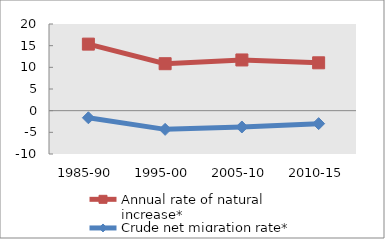
| Category | Annual rate of natural increase* | Crude net migration rate* |
|---|---|---|
| 1985-90 | 15.357 | -1.641 |
| 1995-00 | 10.836 | -4.314 |
| 2005-10 | 11.703 | -3.769 |
| 2010-15 | 11.044 | -2.991 |